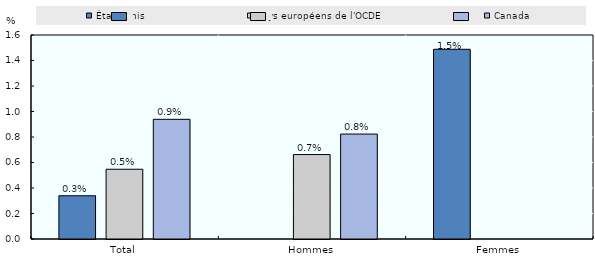
| Category | États-Unis | Pays européens de l'OCDE | Canada |
|---|---|---|---|
| Total | 0.339 | 0.547 | 0.939 |
| Hommes | 0 | 0.662 | 0.823 |
| Femmes | 1.488 | 0 | 0 |